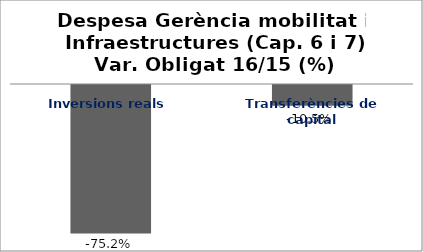
| Category | Series 0 |
|---|---|
| Inversions reals | -0.752 |
| Transferències de capital | -0.105 |